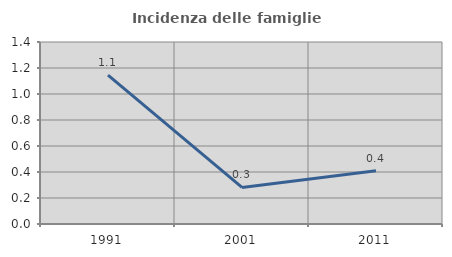
| Category | Incidenza delle famiglie numerose |
|---|---|
| 1991.0 | 1.146 |
| 2001.0 | 0.281 |
| 2011.0 | 0.41 |